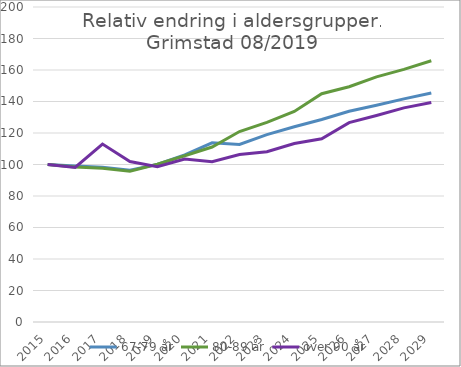
| Category | 67-79 år | 80-89 år | over 90 år |
|---|---|---|---|
| 2015.0 | 100 | 100 | 100 |
| 2016.0 | 99.106 | 98.422 | 98.124 |
| 2017.0 | 98.335 | 97.599 | 112.987 |
| 2018.0 | 96.332 | 95.748 | 101.876 |
| 2019.0 | 100.072 | 100.137 | 98.6 |
| 2020.0 | 106.149 | 105.572 | 103.478 |
| 2021.0 | 113.771 | 111.086 | 101.733 |
| 2022.0 | 112.778 | 120.947 | 106.297 |
| 2023.0 | 118.961 | 126.724 | 108.089 |
| 2024.0 | 123.965 | 133.707 | 113.345 |
| 2025.0 | 128.572 | 144.927 | 116.307 |
| 2026.0 | 133.832 | 149.379 | 126.573 |
| 2027.0 | 137.587 | 155.653 | 131.076 |
| 2028.0 | 141.679 | 160.381 | 135.967 |
| 2029.0 | 145.447 | 165.879 | 139.414 |